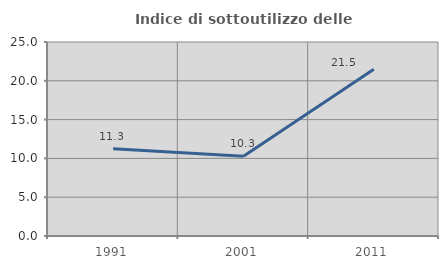
| Category | Indice di sottoutilizzo delle abitazioni  |
|---|---|
| 1991.0 | 11.257 |
| 2001.0 | 10.275 |
| 2011.0 | 21.473 |